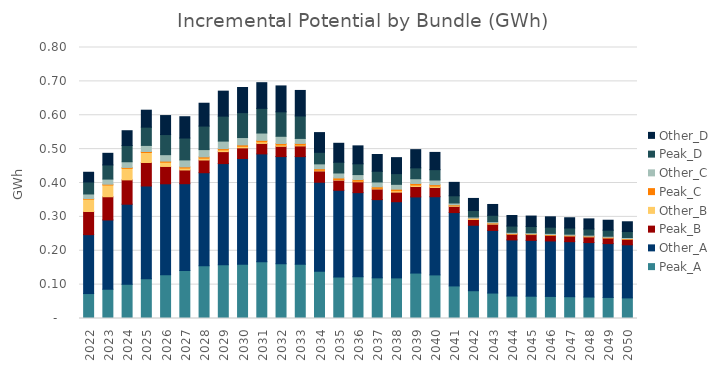
| Category | Peak_A | Other_A | Peak_B | Other_B | Peak_C | Other_C | Peak_D | Other_D |
|---|---|---|---|---|---|---|---|---|
| 2022.0 | 0.074 | 0.174 | 0.068 | 0.036 | 0.002 | 0.013 | 0.035 | 0.029 |
| 2023.0 | 0.086 | 0.205 | 0.069 | 0.035 | 0.002 | 0.015 | 0.042 | 0.034 |
| 2024.0 | 0.101 | 0.236 | 0.072 | 0.034 | 0.003 | 0.017 | 0.048 | 0.044 |
| 2025.0 | 0.117 | 0.274 | 0.069 | 0.03 | 0.003 | 0.018 | 0.054 | 0.05 |
| 2026.0 | 0.129 | 0.269 | 0.051 | 0.012 | 0.003 | 0.019 | 0.059 | 0.056 |
| 2027.0 | 0.142 | 0.256 | 0.04 | 0.006 | 0.004 | 0.021 | 0.065 | 0.063 |
| 2028.0 | 0.156 | 0.275 | 0.037 | 0.005 | 0.004 | 0.021 | 0.069 | 0.067 |
| 2029.0 | 0.158 | 0.299 | 0.035 | 0.005 | 0.004 | 0.022 | 0.074 | 0.074 |
| 2030.0 | 0.16 | 0.312 | 0.031 | 0.005 | 0.004 | 0.022 | 0.074 | 0.074 |
| 2031.0 | 0.168 | 0.318 | 0.031 | 0.005 | 0.004 | 0.022 | 0.073 | 0.076 |
| 2032.0 | 0.162 | 0.316 | 0.03 | 0.004 | 0.004 | 0.021 | 0.072 | 0.076 |
| 2033.0 | 0.16 | 0.318 | 0.032 | 0.003 | 0.005 | 0.015 | 0.066 | 0.075 |
| 2034.0 | 0.139 | 0.263 | 0.033 | 0.002 | 0.005 | 0.014 | 0.034 | 0.058 |
| 2035.0 | 0.122 | 0.256 | 0.03 | 0.002 | 0.005 | 0.015 | 0.032 | 0.056 |
| 2036.0 | 0.123 | 0.248 | 0.032 | 0.002 | 0.005 | 0.015 | 0.032 | 0.053 |
| 2037.0 | 0.12 | 0.231 | 0.031 | 0.002 | 0.005 | 0.014 | 0.032 | 0.05 |
| 2038.0 | 0.12 | 0.225 | 0.028 | 0.004 | 0.005 | 0.014 | 0.032 | 0.047 |
| 2039.0 | 0.134 | 0.225 | 0.031 | 0.004 | 0.005 | 0.014 | 0.032 | 0.054 |
| 2040.0 | 0.129 | 0.231 | 0.027 | 0.004 | 0.004 | 0.014 | 0.03 | 0.051 |
| 2041.0 | 0.096 | 0.217 | 0.018 | 0.002 | 0.002 | 0.005 | 0.021 | 0.04 |
| 2042.0 | 0.082 | 0.193 | 0.017 | 0.002 | 0.001 | 0.004 | 0.019 | 0.036 |
| 2043.0 | 0.075 | 0.185 | 0.018 | 0.002 | 0.001 | 0.004 | 0.019 | 0.032 |
| 2044.0 | 0.066 | 0.166 | 0.017 | 0.001 | 0.001 | 0.003 | 0.018 | 0.031 |
| 2045.0 | 0.066 | 0.165 | 0.017 | 0.001 | 0.001 | 0.003 | 0.018 | 0.031 |
| 2046.0 | 0.065 | 0.164 | 0.017 | 0.001 | 0.001 | 0.003 | 0.018 | 0.031 |
| 2047.0 | 0.064 | 0.162 | 0.017 | 0.001 | 0.001 | 0.003 | 0.018 | 0.03 |
| 2048.0 | 0.063 | 0.161 | 0.017 | 0.001 | 0.001 | 0.003 | 0.018 | 0.03 |
| 2049.0 | 0.062 | 0.159 | 0.017 | 0.001 | 0.001 | 0.003 | 0.018 | 0.029 |
| 2050.0 | 0.061 | 0.157 | 0.017 | 0.001 | 0.001 | 0.003 | 0.018 | 0.029 |